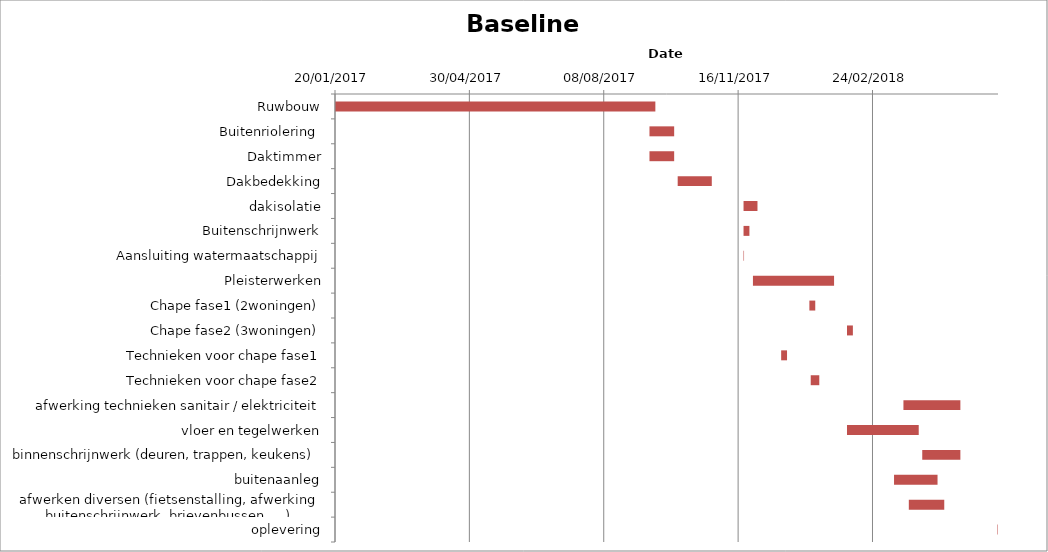
| Category | Baseline start | Actual duration |
|---|---|---|
| Ruwbouw | 20/01/2017 | 238.375 |
| Buitenriolering  | 11/09/2017 | 18.375 |
| Daktimmer | 11/09/2017 | 18.375 |
| Dakbedekking | 02/10/2017 | 25.375 |
| dakisolatie | 20/11/2017 | 10.375 |
| Buitenschrijnwerk | 20/11/2017 | 4.375 |
| Aansluiting watermaatschappij | 20/11/2017 | 0.375 |
| Pleisterwerken | 27/11/2017 | 60.375 |
| Chape fase1 (2woningen) | 08/01/2018 | 4.375 |
| Chape fase2 (3woningen) | 05/02/2018 | 4.375 |
| Technieken voor chape fase1 | 18/12/2017 | 4.375 |
| Technieken voor chape fase2 | 09/01/2018 | 6.375 |
| afwerking technieken sanitair / elektriciteit | 19/03/2018 | 42.375 |
| vloer en tegelwerken | 05/02/2018 | 53.375 |
| binnenschrijnwerk (deuren, trappen, keukens) | 02/04/2018 | 28.375 |
| buitenaanleg | 12/03/2018 | 32.375 |
| afwerken diversen (fietsenstalling, afwerking_x000d_ buitenschrijnwerk, brievenbussen, …) | 23/03/2018 | 26.375 |
| oplevering | 28/05/2018 | 0.375 |